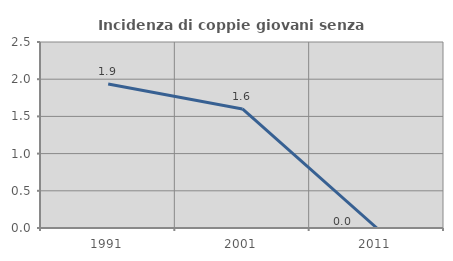
| Category | Incidenza di coppie giovani senza figli |
|---|---|
| 1991.0 | 1.935 |
| 2001.0 | 1.6 |
| 2011.0 | 0 |